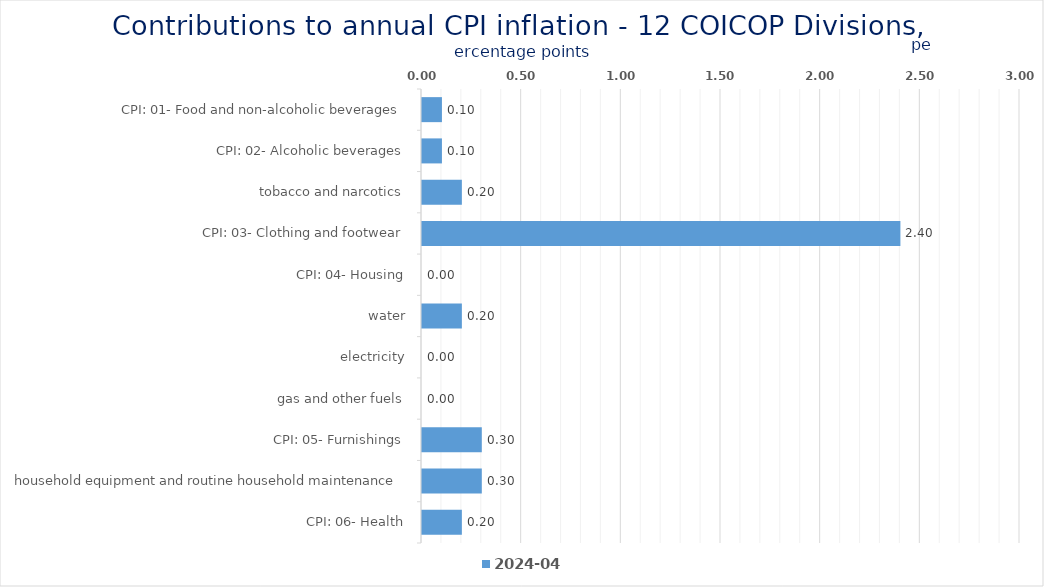
| Category | 2024-04 |
|---|---|
| CPI: 01- Food and non-alcoholic beverages | 0.1 |
| CPI: 02- Alcoholic beverages, tobacco and narcotics | 0.1 |
| CPI: 03- Clothing and footwear | 0.2 |
| CPI: 04- Housing, water, electricity, gas and other fuels | 2.4 |
| CPI: 05- Furnishings, household equipment and routine household maintenance | 0 |
| CPI: 06- Health | 0.2 |
| CPI: 07- Transport | 0 |
| CPI: 08- Communication | 0 |
| CPI: 09- Recreation and culture | 0.3 |
| CPI: 11- Restaurants and hotels | 0.3 |
| CPI: 12- Miscellaneous goods and services | 0.2 |